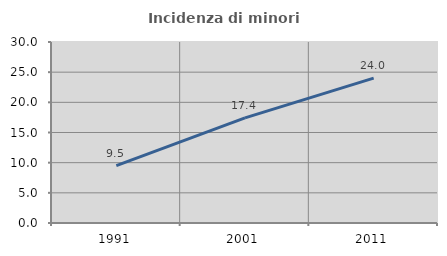
| Category | Incidenza di minori stranieri |
|---|---|
| 1991.0 | 9.524 |
| 2001.0 | 17.424 |
| 2011.0 | 24.011 |